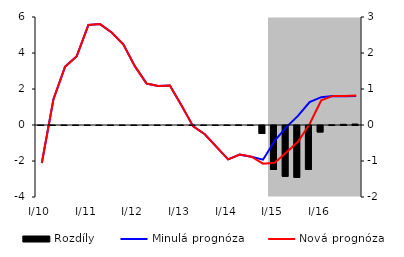
| Category | Rozdíly |
|---|---|
| 0 | 0 |
| 1 | 0 |
| 2 | 0 |
| 3 | 0 |
| 4 | 0 |
| 5 | 0 |
| 6 | 0 |
| 7 | 0 |
| 8 | 0 |
| 9 | 0 |
| 10 | 0 |
| 11 | 0 |
| 12 | 0 |
| 13 | 0 |
| 14 | 0 |
| 15 | 0 |
| 16 | 0 |
| 17 | 0.002 |
| 18 | 0 |
| 19 | -0.222 |
| 20 | -1.222 |
| 21 | -1.411 |
| 22 | -1.439 |
| 23 | -1.22 |
| 24 | -0.18 |
| 25 | 0.004 |
| 26 | 0.019 |
| 27 | 0.027 |